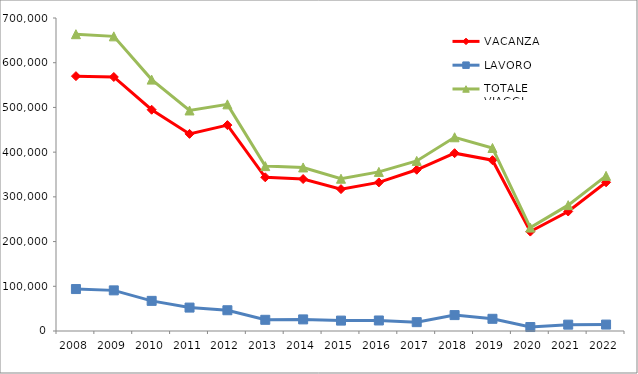
| Category | VACANZA | LAVORO | TOTALE VIAGGI |
|---|---|---|---|
| 2008 | 569942 | 93804 | 663746 |
| 2009 | 568103 | 90861 | 658964 |
| 2010 | 494811 | 67399 | 562211 |
| 2011 | 440821 | 52379 | 493200 |
| 2012 | 460442 | 46426 | 506868 |
| 2013 | 343728 | 25028 | 368756 |
| 2014 | 339850 | 25932 | 365782 |
| 2015 | 317307 | 23250 | 340557 |
| 2016 | 332304 | 23545 | 355849 |
| 2017 | 360609 | 19802 | 380411 |
| 2018 | 397697 | 35549 | 433246 |
| 2019 | 382004 | 27269 | 409273 |
| 2020 | 222327 | 8871 | 231197 |
| 2021 | 267276 | 14195 | 281471 |
| 2022 | 332592 | 14374 | 346966 |